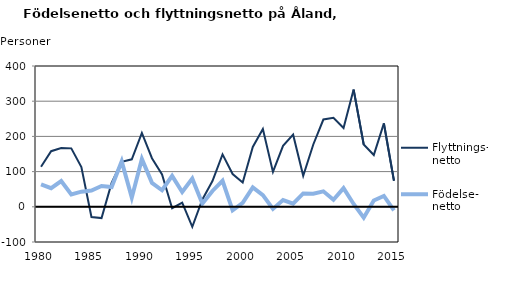
| Category | Flyttnings- netto | Födelse- netto |
|---|---|---|
| 1980.0 | 114 | 64 |
| 1981.0 | 158 | 53 |
| 1982.0 | 167 | 73 |
| 1983.0 | 166 | 35 |
| 1984.0 | 113 | 43 |
| 1985.0 | -29 | 46 |
| 1986.0 | -32 | 59 |
| 1987.0 | 68 | 56 |
| 1988.0 | 128 | 129 |
| 1989.0 | 135 | 26 |
| 1990.0 | 210 | 136 |
| 1991.0 | 138 | 68 |
| 1992.0 | 92 | 47 |
| 1993.0 | -4 | 88 |
| 1994.0 | 12 | 42 |
| 1995.0 | -57 | 80 |
| 1996.0 | 21 | 9 |
| 1997.0 | 73 | 45 |
| 1998.0 | 149 | 74 |
| 1999.0 | 93 | -10 |
| 2000.0 | 69 | 11 |
| 2001.0 | 170 | 55 |
| 2002.0 | 221 | 33 |
| 2003.0 | 99 | -6 |
| 2004.0 | 173 | 19 |
| 2005.0 | 205 | 9 |
| 2006.0 | 88 | 38 |
| 2007.0 | 177 | 37 |
| 2008.0 | 248 | 44 |
| 2009.0 | 253 | 20 |
| 2010.0 | 224 | 53 |
| 2011.0 | 333 | 8 |
| 2012.0 | 177 | -31 |
| 2013.0 | 147 | 18 |
| 2014.0 | 237 | 31 |
| 2015.0 | 74 | -10 |